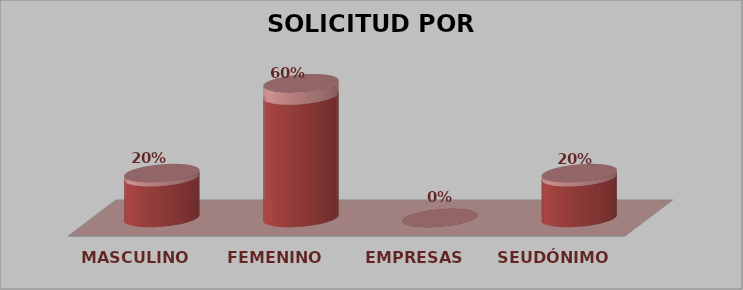
| Category | SOLICITUD POR GÉNERO | Series 1 |
|---|---|---|
| MASCULINO | 2 | 0.2 |
| FEMENINO | 6 | 0.6 |
| EMPRESAS | 0 | 0 |
| SEUDÓNIMO | 2 | 0.2 |